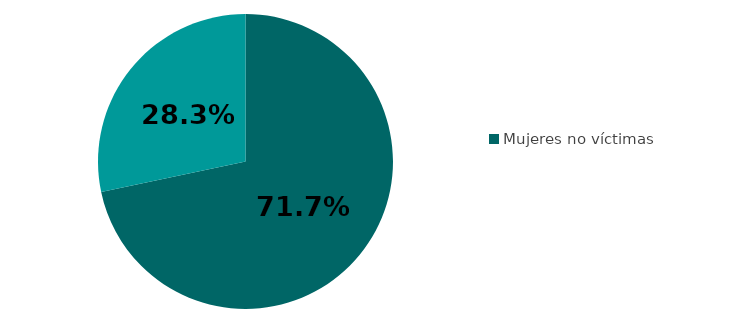
| Category | % sobre mujeres que han tenido pareja alguna vez |
|---|---|
| 0 | 71.694 |
| 1 | 28.306 |